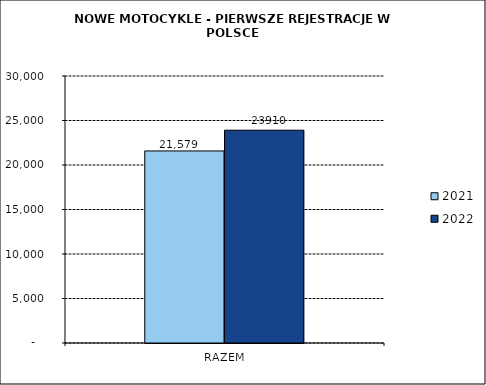
| Category | 2021 | 2022 |
|---|---|---|
| RAZEM | 21579 | 23910 |